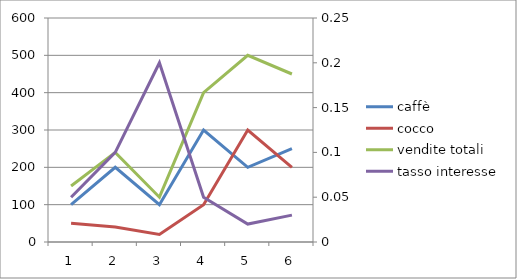
| Category | caffè | cocco | vendite totali |
|---|---|---|---|
| 0 | 100 | 50 | 150 |
| 1 | 200 | 40 | 240 |
| 2 | 100 | 20 | 120 |
| 3 | 300 | 100 | 400 |
| 4 | 200 | 300 | 500 |
| 5 | 250 | 200 | 450 |